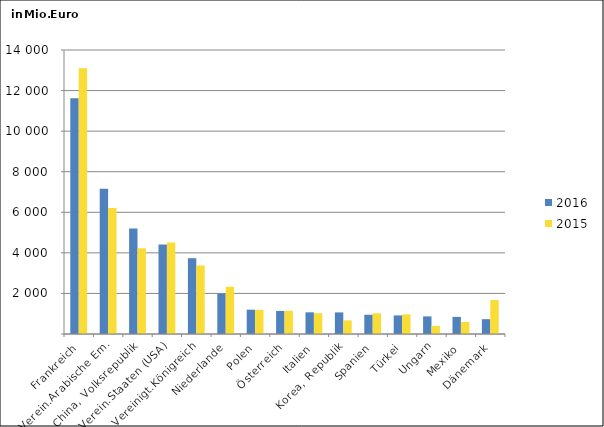
| Category | 2016 | 2015 |
|---|---|---|
| Frankreich | 11624.368 | 13106.191 |
| Verein.Arabische Em. | 7160.71 | 6215.225 |
| China, Volksrepublik | 5198.435 | 4228.785 |
| Verein.Staaten (USA) | 4406.845 | 4504.952 |
| Vereinigt.Königreich | 3737.251 | 3378.936 |
| Niederlande | 1987.775 | 2327.606 |
| Polen | 1198.491 | 1188.419 |
| Österreich | 1136.792 | 1144.253 |
| Italien | 1068.44 | 1025.286 |
| Korea, Republik | 1064.372 | 671.264 |
| Spanien | 949.547 | 1020.96 |
| Türkei | 916.518 | 967.982 |
| Ungarn | 868.191 | 399.086 |
| Mexiko | 842.216 | 593.765 |
| Dänemark | 730.184 | 1678.832 |